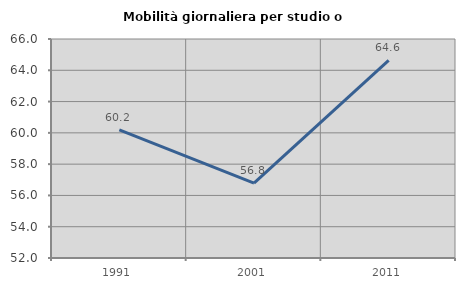
| Category | Mobilità giornaliera per studio o lavoro |
|---|---|
| 1991.0 | 60.19 |
| 2001.0 | 56.791 |
| 2011.0 | 64.64 |